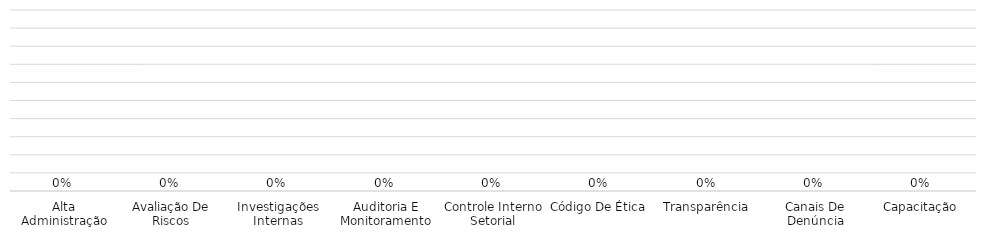
| Category | Series 0 |
|---|---|
| Alta Administração | 0 |
| Avaliação De Riscos | 0 |
| Investigações Internas | 0 |
| Auditoria E Monitoramento | 0 |
| Controle Interno Setorial | 0 |
| Código De Ética | 0 |
| Transparência | 0 |
| Canais De Denúncia | 0 |
| Capacitação | 0 |